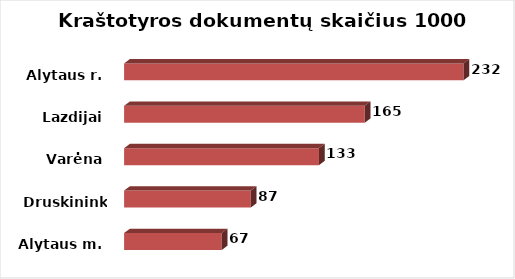
| Category | Series 0 |
|---|---|
| Alytaus m. | 66.876 |
| Druskininkai | 86.725 |
| Varėna | 133.437 |
| Lazdijai | 164.75 |
| Alytaus r. | 232.363 |